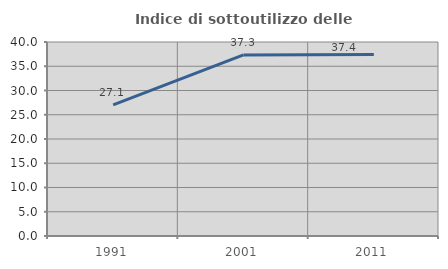
| Category | Indice di sottoutilizzo delle abitazioni  |
|---|---|
| 1991.0 | 27.056 |
| 2001.0 | 37.344 |
| 2011.0 | 37.405 |